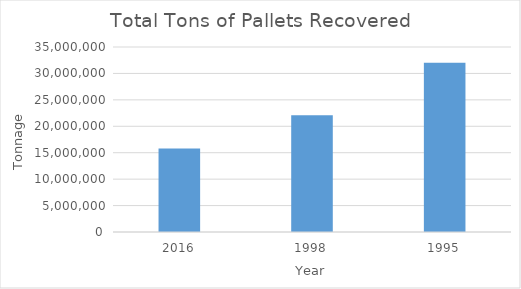
| Category | Pallets |
|---|---|
| 2016.0 | 15789872.715 |
| 1998.0 | 22072727.273 |
| 1995.0 | 32030000 |